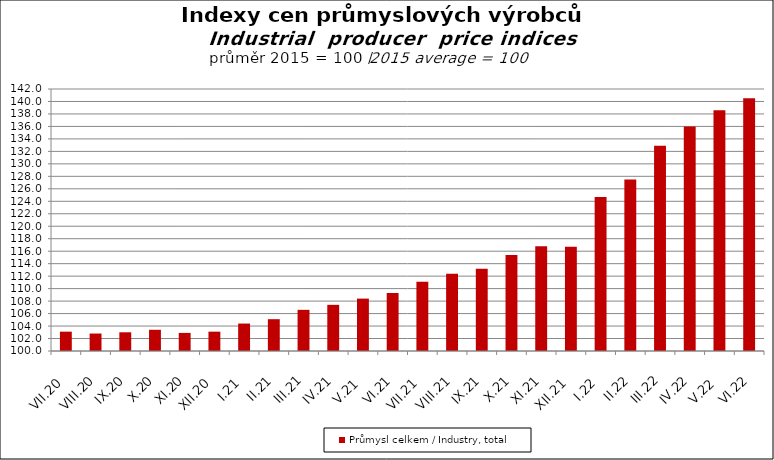
| Category | Průmysl celkem / Industry, total |
|---|---|
| VII.20 | 103.1 |
| VIII.20 | 102.8 |
| IX.20 | 103 |
| X.20 | 103.4 |
| XI.20 | 102.9 |
| XII.20 | 103.1 |
| I.21 | 104.4 |
| II.21 | 105.1 |
| III.21 | 106.6 |
| IV.21 | 107.4 |
| V.21 | 108.4 |
| VI.21 | 109.3 |
| VII.21 | 111.1 |
| VIII.21 | 112.4 |
| IX.21 | 113.2 |
| X.21 | 115.4 |
| XI.21 | 116.8 |
| XII.21 | 116.7 |
| I.22 | 124.7 |
| II.22 | 127.5 |
| III.22 | 132.9 |
| IV.22 | 136 |
| V.22 | 138.6 |
| VI.22 | 140.5 |